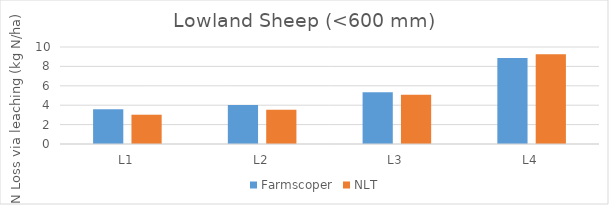
| Category | Farmscoper | NLT |
|---|---|---|
| L1 | 3.571 | 3.02 |
| L2 | 4.012 | 3.54 |
| L3 | 5.334 | 5.09 |
| L4 | 8.861 | 9.24 |